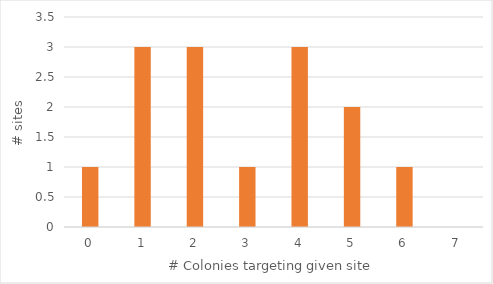
| Category | # Sites |
|---|---|
| 0.0 | 1 |
| 1.0 | 3 |
| 2.0 | 3 |
| 3.0 | 1 |
| 4.0 | 3 |
| 5.0 | 2 |
| 6.0 | 1 |
| 7.0 | 0 |